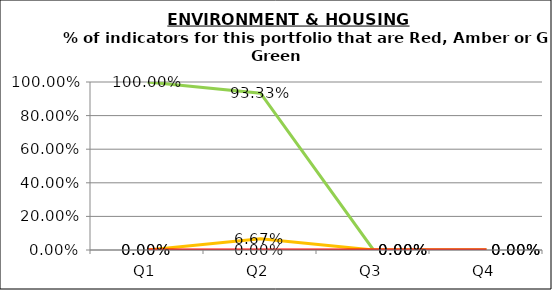
| Category | Green | Amber | Red |
|---|---|---|---|
| Q1 | 1 | 0 | 0 |
| Q2 | 0.933 | 0.067 | 0 |
| Q3 | 0 | 0 | 0 |
| Q4 | 0 | 0 | 0 |